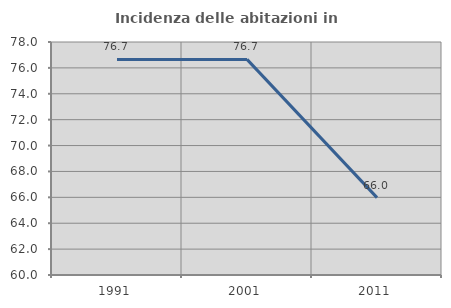
| Category | Incidenza delle abitazioni in proprietà  |
|---|---|
| 1991.0 | 76.653 |
| 2001.0 | 76.656 |
| 2011.0 | 65.976 |